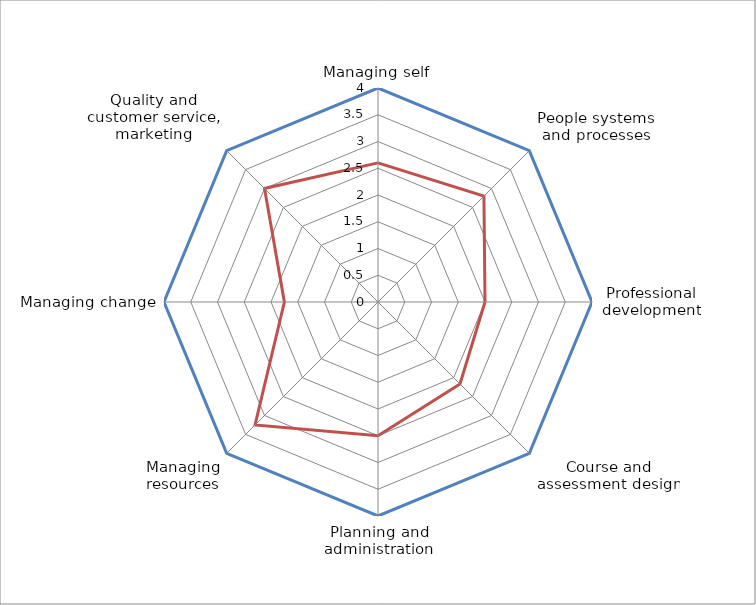
| Category | Series 0 | Series 1 |
|---|---|---|
| Managing self | 4 | 2.6 |
| People systems and processes | 4 | 2.8 |
| Professional development | 4 | 2 |
| Course and assessment design | 4 | 2.167 |
| Planning and administration | 4 | 2.5 |
| Managing resources | 4 | 3.25 |
| Managing change | 4 | 1.75 |
| Quality and customer service, marketing | 4 | 3 |